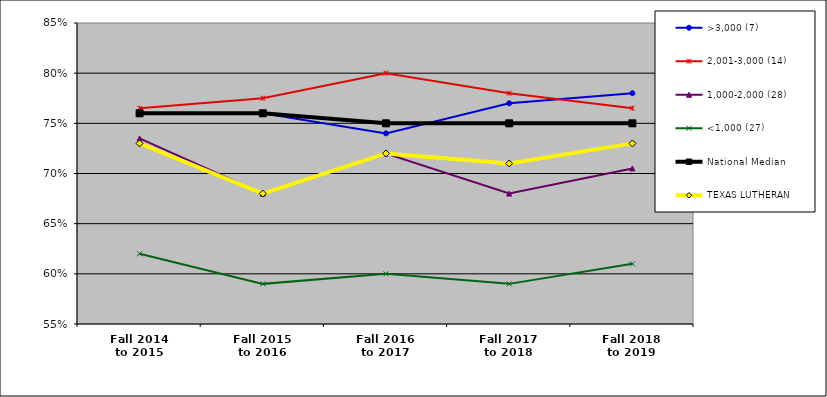
| Category | >3,000 (7) | 2,001-3,000 (14) | 1,000-2,000 (28) | <1,000 (27) | National Median | TEXAS LUTHERAN |
|---|---|---|---|---|---|---|
| Fall 2014
to 2015 | 0.76 | 0.765 | 0.735 | 0.62 | 0.76 | 0.73 |
| Fall 2015
to 2016 | 0.76 | 0.775 | 0.68 | 0.59 | 0.76 | 0.68 |
| Fall 2016
to 2017 | 0.74 | 0.8 | 0.72 | 0.6 | 0.75 | 0.72 |
| Fall 2017
to 2018 | 0.77 | 0.78 | 0.68 | 0.59 | 0.75 | 0.71 |
| Fall 2018
to 2019 | 0.78 | 0.765 | 0.705 | 0.61 | 0.75 | 0.73 |